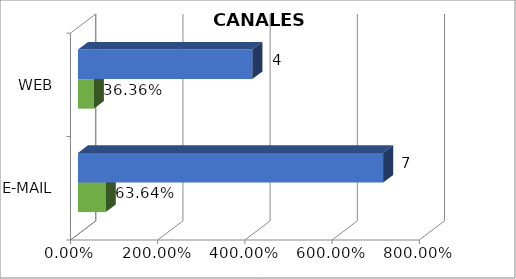
| Category | Cuenta de Número petición2 | Cuenta de Número petición |
|---|---|---|
| E-MAIL | 0.636 | 7 |
| WEB | 0.364 | 4 |